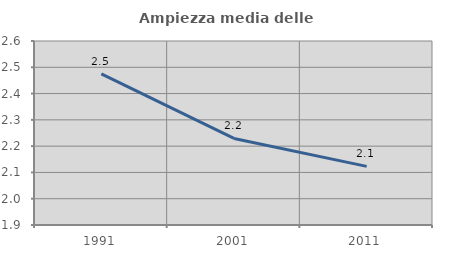
| Category | Ampiezza media delle famiglie |
|---|---|
| 1991.0 | 2.475 |
| 2001.0 | 2.229 |
| 2011.0 | 2.123 |